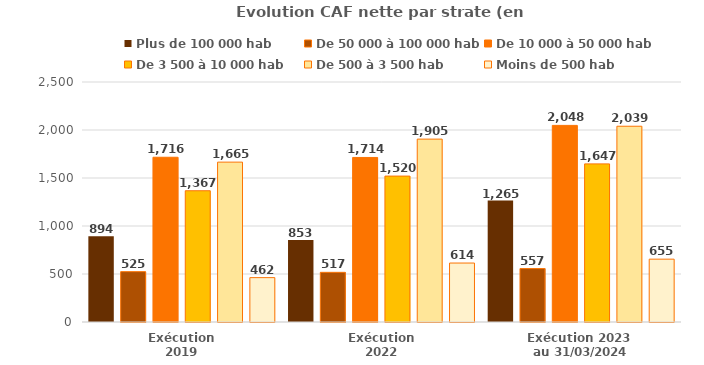
| Category | Plus de 100 000 hab | De 50 000 à 100 000 hab | De 10 000 à 50 000 hab | De 3 500 à 10 000 hab | De 500 à 3 500 hab | Moins de 500 hab |
|---|---|---|---|---|---|---|
| Exécution
2019 | 894.2 | 524.5 | 1716 | 1367.2 | 1665.3 | 462.2 |
| Exécution
2022 | 853.4 | 517.3 | 1713.9 | 1519.9 | 1905 | 614.2 |
| Exécution 2023 
au 31/03/2024 | 1264.9 | 556.8 | 2047.9 | 1647 | 2039.1 | 654.5 |